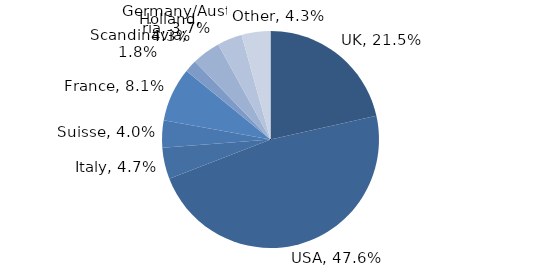
| Category | Investment Style |
|---|---|
| UK | 0.215 |
| USA | 0.476 |
| Italy | 0.047 |
| Suisse | 0.04 |
| France | 0.081 |
| Scandinavia | 0.018 |
| Holland | 0.043 |
| Germany/Austria | 0.037 |
| Other | 0.043 |